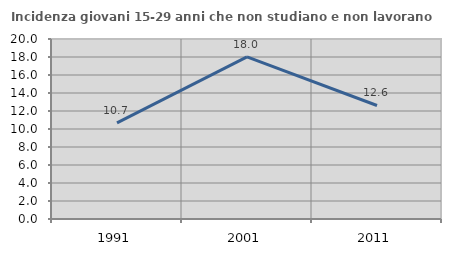
| Category | Incidenza giovani 15-29 anni che non studiano e non lavorano  |
|---|---|
| 1991.0 | 10.682 |
| 2001.0 | 18.015 |
| 2011.0 | 12.613 |